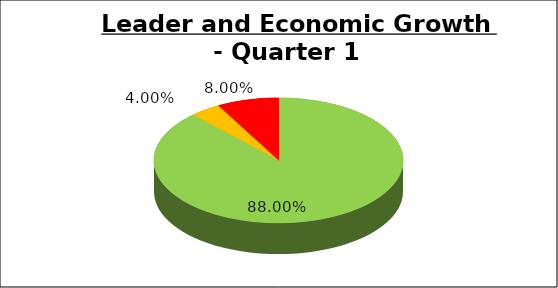
| Category | Q1 |
|---|---|
| Green | 0.88 |
| Amber | 0.04 |
| Red | 0.08 |